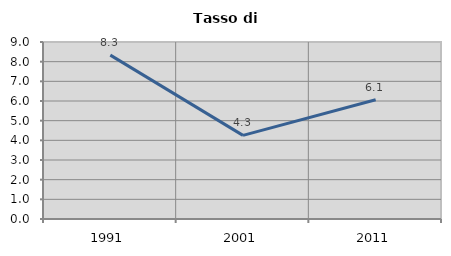
| Category | Tasso di disoccupazione   |
|---|---|
| 1991.0 | 8.333 |
| 2001.0 | 4.251 |
| 2011.0 | 6.066 |